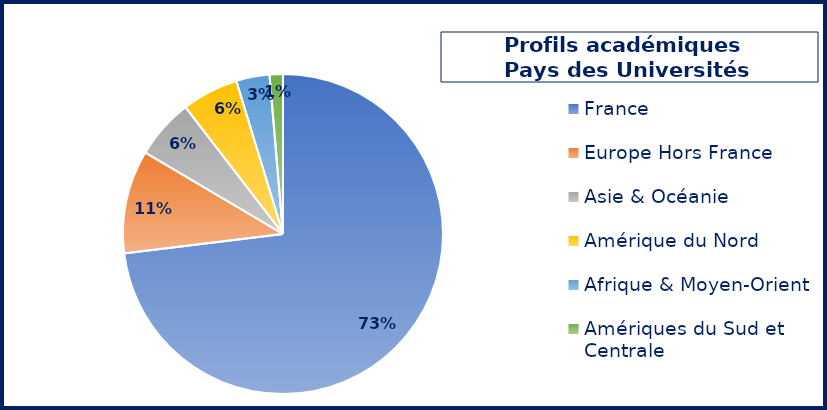
| Category | Series 0 |
|---|---|
| France | 0.731 |
| Europe Hors France | 0.104 |
| Asie & Océanie | 0.061 |
| Amérique du Nord | 0.057 |
| Afrique & Moyen-Orient | 0.034 |
| Amériques du Sud et Centrale | 0.013 |